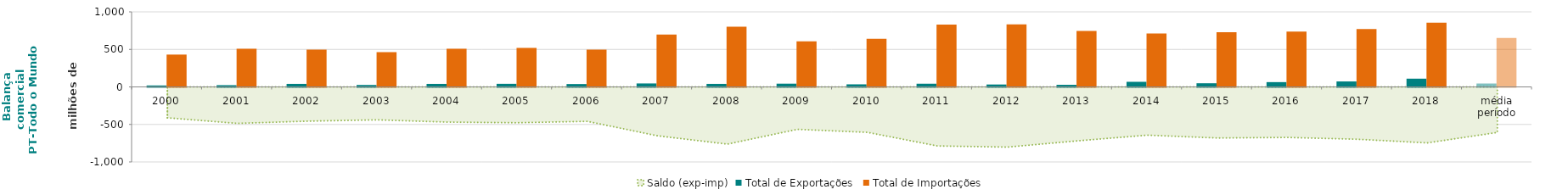
| Category | Total de Exportações  | Total de Importações  |
|---|---|---|
| 2000 | 18.76 | 430.782 |
| 2001 | 22.642 | 508.857 |
| 2002 | 40.29 | 496.847 |
| 2003 | 25.413 | 464.422 |
| 2004 | 40.041 | 509.224 |
| 2005 | 41.18 | 518.558 |
| 2006 | 38.041 | 497.247 |
| 2007 | 46.069 | 697.748 |
| 2008 | 40.182 | 802.757 |
| 2009 | 43.124 | 608.738 |
| 2010 | 34.269 | 640.042 |
| 2011 | 42.44 | 829.525 |
| 2012 | 32.005 | 834.33 |
| 2013 | 27.705 | 746.74 |
| 2014 | 67.868 | 710.988 |
| 2015 | 48.616 | 729.366 |
| 2016 | 63.8 | 737.446 |
| 2017 | 72.834 | 770.613 |
| 2018 | 109.725 | 855.707 |
| média período | 45 | 652.102 |